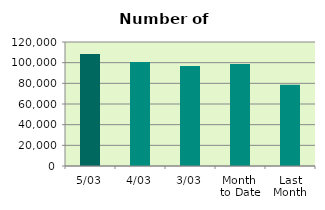
| Category | Series 0 |
|---|---|
| 5/03 | 108462 |
| 4/03 | 100580 |
| 3/03 | 96776 |
| Month 
to Date | 98607.2 |
| Last
Month | 78748.7 |